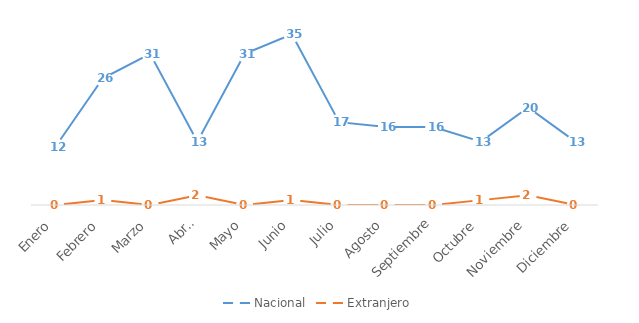
| Category | Nacional | Extranjero |
|---|---|---|
| Enero | 12 | 0 |
| Febrero | 26 | 1 |
| Marzo | 31 | 0 |
| Abril | 13 | 2 |
| Mayo | 31 | 0 |
| Junio | 35 | 1 |
| Julio | 17 | 0 |
| Agosto | 16 | 0 |
| Septiembre | 16 | 0 |
| Octubre | 13 | 1 |
| Noviembre | 20 | 2 |
| Diciembre | 13 | 0 |